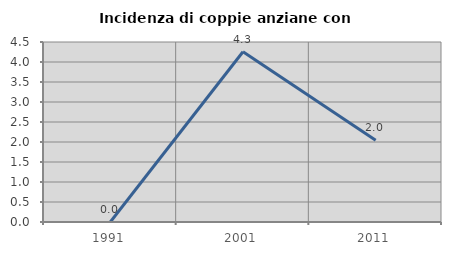
| Category | Incidenza di coppie anziane con figli |
|---|---|
| 1991.0 | 0 |
| 2001.0 | 4.255 |
| 2011.0 | 2.041 |